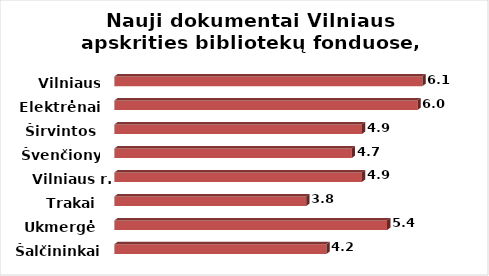
| Category | Series 0 |
|---|---|
| Šalčininkai | 4.2 |
| Ukmergė | 5.4 |
| Trakai | 3.8 |
| Vilniaus r. | 4.9 |
| Švenčionys | 4.7 |
| Širvintos | 4.9 |
| Elektrėnai | 6 |
| Vilniaus m. | 6.1 |